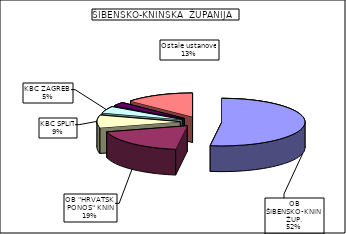
| Category | Series 0 |
|---|---|
| OB ŠIBENSKO-KNIN.ŽUP. | 52.223 |
| OB "HRVATSKI PONOS" KNIN | 18.66 |
| KBC SPLIT | 8.616 |
| KBC ZAGREB  | 4.607 |
| KBC SESTRE MILOSRDNICE | 2.522 |
| Ostale ustanove | 13.371 |